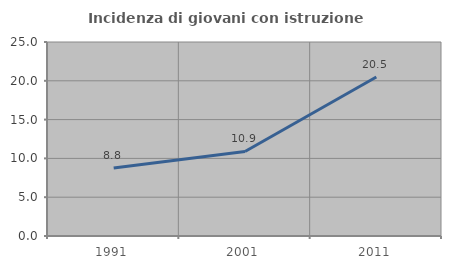
| Category | Incidenza di giovani con istruzione universitaria |
|---|---|
| 1991.0 | 8.756 |
| 2001.0 | 10.892 |
| 2011.0 | 20.497 |